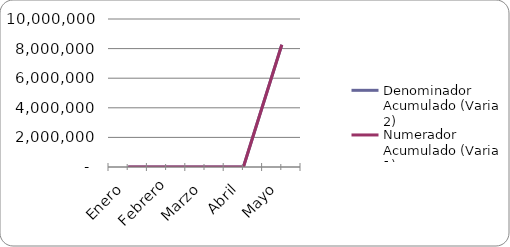
| Category | Denominador Acumulado (Variable 2) | Numerador Acumulado (Variable 1) |
|---|---|---|
| Enero  | 0 | 0 |
| Febrero | 0 | 0 |
| Marzo | 0 | 0 |
| Abril | 0 | 0 |
| Mayo | 8265100 | 8265100 |